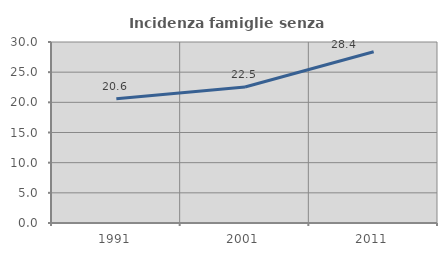
| Category | Incidenza famiglie senza nuclei |
|---|---|
| 1991.0 | 20.585 |
| 2001.0 | 22.547 |
| 2011.0 | 28.392 |